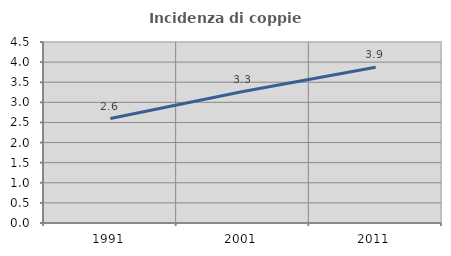
| Category | Incidenza di coppie miste |
|---|---|
| 1991.0 | 2.597 |
| 2001.0 | 3.268 |
| 2011.0 | 3.871 |